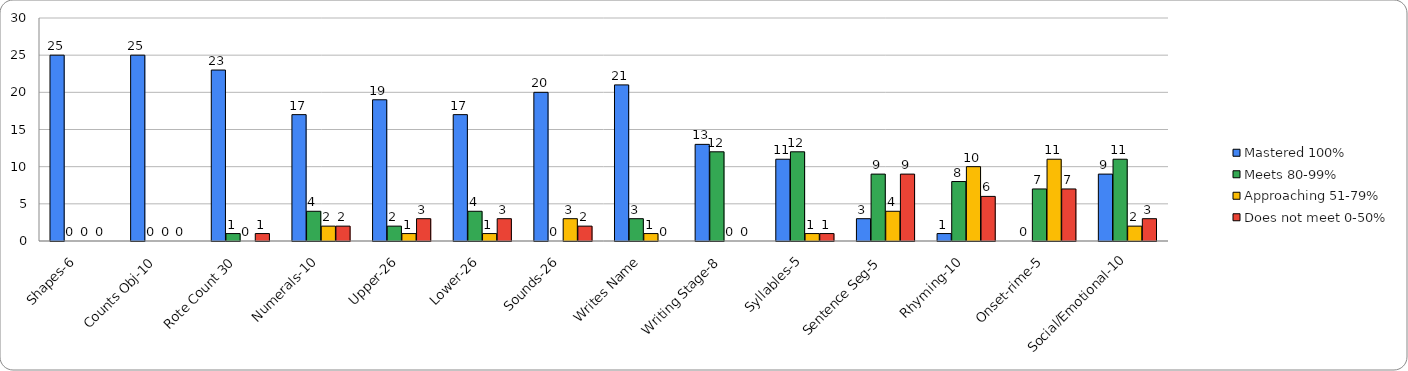
| Category | Mastered 100% | Meets 80-99% | Approaching 51-79% | Does not meet 0-50% |
|---|---|---|---|---|
| Shapes-6 | 25 | 0 | 0 | 0 |
| Counts Obj-10 | 25 | 0 | 0 | 0 |
| Rote Count 30 | 23 | 1 | 0 | 1 |
| Numerals-10 | 17 | 4 | 2 | 2 |
| Upper-26 | 19 | 2 | 1 | 3 |
| Lower-26 | 17 | 4 | 1 | 3 |
| Sounds-26 | 20 | 0 | 3 | 2 |
| Writes Name | 21 | 3 | 1 | 0 |
| Writing Stage-8 | 13 | 12 | 0 | 0 |
| Syllables-5 | 11 | 12 | 1 | 1 |
| Sentence Seg-5 | 3 | 9 | 4 | 9 |
| Rhyming-10 | 1 | 8 | 10 | 6 |
| Onset-rime-5 | 0 | 7 | 11 | 7 |
| Social/Emotional-10 | 9 | 11 | 2 | 3 |